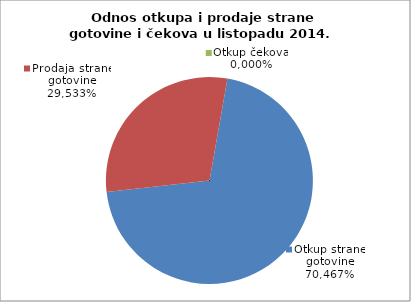
| Category | Otkup strane gotovine |
|---|---|
| 0 | 0.705 |
| 1 | 0.295 |
| 2 | 0 |